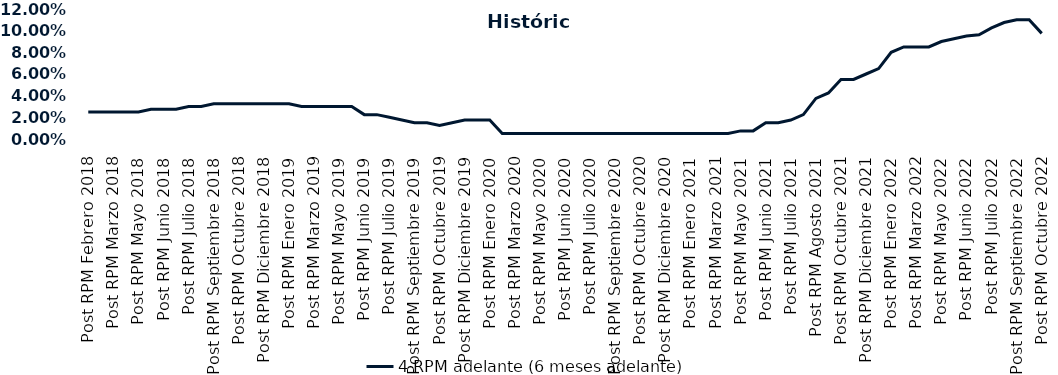
| Category | 4 RPM adelante (6 meses adelante) |
|---|---|
| Post RPM Febrero 2018 | 0.025 |
| Pre RPM Marzo 2018 | 0.025 |
| Post RPM Marzo 2018 | 0.025 |
| Pre RPM Mayo 2018 | 0.025 |
| Post RPM Mayo 2018 | 0.025 |
| Pre RPM Junio 2018 | 0.028 |
| Post RPM Junio 2018 | 0.028 |
| Pre RPM Julio 2018 | 0.028 |
| Post RPM Julio 2018 | 0.03 |
| Pre RPM Septiembre 2018 | 0.03 |
| Post RPM Septiembre 2018 | 0.032 |
| Pre RPM Octubre 2018 | 0.032 |
| Post RPM Octubre 2018 | 0.032 |
| Pre RPM Diciembre 2018 | 0.032 |
| Post RPM Diciembre 2018 | 0.032 |
| Pre RPM Enero 2019 | 0.032 |
| Post RPM Enero 2019 | 0.032 |
| Pre RPM Marzo 2019 | 0.03 |
| Post RPM Marzo 2019 | 0.03 |
| Pre RPM Mayo 2019 | 0.03 |
| Post RPM Mayo 2019 | 0.03 |
| Pre RPM Junio 2019 | 0.03 |
| Post RPM Junio 2019 | 0.022 |
| Pre RPM Julio 2019 | 0.022 |
| Post RPM Julio 2019 | 0.02 |
| Pre RPM Septiembre 2019 | 0.018 |
| Post RPM Septiembre 2019 | 0.015 |
| Pre RPM Octubre 2019 | 0.015 |
| Post RPM Octubre 2019 | 0.012 |
| Pre RPM Diciembre 2019 | 0.015 |
| Post RPM Diciembre 2019 | 0.018 |
| Pre RPM Enero 2020 | 0.018 |
| Post RPM Enero 2020 | 0.018 |
| Pre RPM Marzo 2020 | 0.005 |
| Post RPM Marzo 2020 | 0.005 |
| Pre RPM Mayo 2020 | 0.005 |
| Post RPM Mayo 2020 | 0.005 |
| Pre RPM Junio 2020 | 0.005 |
| Post RPM Junio 2020 | 0.005 |
| Pre RPM Julio 2020 | 0.005 |
| Post RPM Julio 2020 | 0.005 |
| Pre RPM Septiembre 2020 | 0.005 |
| Post RPM Septiembre 2020 | 0.005 |
| Pre RPM Octubre 2020 | 0.005 |
| Post RPM Octubre 2020 | 0.005 |
| Pre RPM Diciembre 2020 | 0.005 |
| Post RPM Diciembre 2020 | 0.005 |
| Pre RPM Enero 2021 | 0.005 |
| Post RPM Enero 2021 | 0.005 |
| Pre RPM Marzo 2021 | 0.005 |
| Post RPM Marzo 2021 | 0.005 |
| Pre RPM Mayo 2021 | 0.005 |
| Post RPM Mayo 2021 | 0.008 |
| Pre RPM Junio 2021 | 0.008 |
| Post RPM Junio 2021 | 0.015 |
| Pre RPM Julio 2021 | 0.015 |
| Post RPM Julio 2021 | 0.018 |
| Pre RPM Agosto 2021 | 0.022 |
| Post RPM Agosto 2021 | 0.038 |
| Pre RPM Octubre 2021 | 0.042 |
| Post RPM Octubre 2021 | 0.055 |
| Pre RPM Diciembre 2021 | 0.055 |
| Post RPM Diciembre 2021 | 0.06 |
| Pre RPM Enero 2022 | 0.065 |
| Post RPM Enero 2022 | 0.08 |
| Pre RPM Marzo 2022 | 0.085 |
| Post RPM Marzo 2022 | 0.085 |
| Pre RPM Mayo 2022 | 0.085 |
| Post RPM Mayo 2022 | 0.09 |
| Pre RPM Junio 2022 | 0.092 |
| Post RPM Junio 2022 | 0.095 |
| Pre RPM Julio 2022 | 0.096 |
| Post RPM Julio 2022 | 0.102 |
| Pre RPM Septiembre 2022 | 0.108 |
| Post RPM Septiembre 2022 | 0.11 |
| Pre RPM Octubre 2022 | 0.11 |
| Post RPM Octubre 2022 | 0.098 |